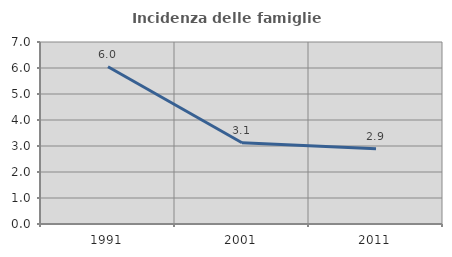
| Category | Incidenza delle famiglie numerose |
|---|---|
| 1991.0 | 6.046 |
| 2001.0 | 3.125 |
| 2011.0 | 2.892 |